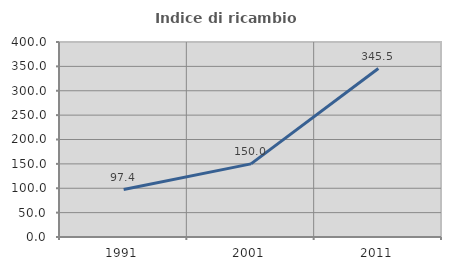
| Category | Indice di ricambio occupazionale  |
|---|---|
| 1991.0 | 97.419 |
| 2001.0 | 150 |
| 2011.0 | 345.536 |